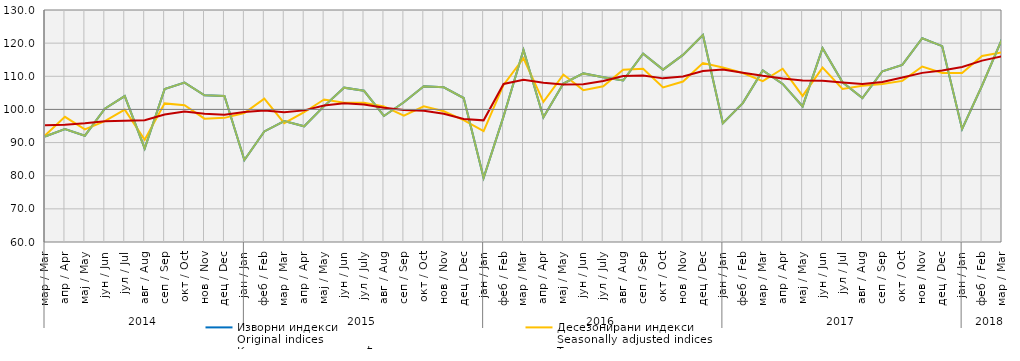
| Category | Изворни индекси
Original indices | Десезонирани индекси
Seasonally adjusted indices | Календарски прилагођени индекси
Working-day adjusted indices | Тренд
Trend |
|---|---|---|---|---|
| 0 | 91.819 | 92.148 | 91.819 | 95.221 |
| 1 | 94.098 | 97.769 | 94.098 | 95.385 |
| 2 | 92.073 | 93.987 | 92.073 | 95.834 |
| 3 | 100.223 | 96.462 | 100.223 | 96.444 |
| 4 | 104.036 | 99.916 | 104.036 | 96.582 |
| 5 | 88.225 | 90.838 | 88.225 | 96.764 |
| 6 | 106.132 | 101.823 | 106.132 | 98.447 |
| 7 | 108.074 | 101.276 | 108.074 | 99.381 |
| 8 | 104.242 | 97.219 | 104.242 | 98.666 |
| 9 | 104.032 | 97.459 | 104.032 | 98.41 |
| 10 | 84.716 | 98.882 | 84.716 | 99.254 |
| 11 | 93.365 | 103.251 | 93.365 | 99.647 |
| 12 | 96.491 | 95.863 | 96.491 | 99.131 |
| 13 | 94.914 | 99.15 | 94.914 | 99.711 |
| 14 | 101.001 | 103.004 | 101.001 | 101.207 |
| 15 | 106.571 | 102.05 | 106.571 | 101.87 |
| 16 | 105.634 | 101.989 | 105.634 | 101.48 |
| 17 | 98.032 | 100.923 | 98.032 | 100.541 |
| 18 | 102.175 | 98.119 | 102.175 | 99.843 |
| 19 | 106.973 | 100.927 | 106.973 | 99.608 |
| 20 | 106.679 | 99.459 | 106.679 | 98.701 |
| 21 | 103.448 | 96.757 | 103.448 | 97.119 |
| 22 | 79.358 | 93.437 | 79.358 | 96.709 |
| 23 | 97.898 | 107.388 | 97.898 | 107.672 |
| 24 | 117.913 | 115.451 | 117.913 | 108.92 |
| 25 | 97.629 | 102.272 | 97.629 | 108.062 |
| 26 | 107.793 | 110.515 | 107.793 | 107.502 |
| 27 | 110.869 | 105.829 | 110.869 | 107.588 |
| 28 | 109.684 | 107.005 | 109.684 | 108.553 |
| 29 | 108.719 | 111.971 | 108.719 | 110.088 |
| 30 | 116.799 | 112.303 | 116.799 | 110.22 |
| 31 | 112.011 | 106.633 | 112.011 | 109.372 |
| 32 | 116.451 | 108.413 | 116.451 | 109.942 |
| 33 | 122.432 | 114.009 | 122.432 | 111.578 |
| 34 | 95.812 | 112.675 | 95.812 | 112.013 |
| 35 | 101.907 | 110.989 | 101.907 | 111.084 |
| 36 | 111.746 | 108.554 | 111.746 | 110.137 |
| 37 | 107.7 | 112.273 | 107.7 | 109.349 |
| 38 | 100.901 | 104.069 | 100.901 | 108.717 |
| 39 | 118.466 | 112.61 | 118.466 | 108.644 |
| 40 | 108.212 | 106.193 | 108.212 | 108.132 |
| 41 | 103.433 | 107.11 | 103.433 | 107.692 |
| 42 | 111.521 | 107.677 | 111.521 | 108.253 |
| 43 | 113.414 | 108.611 | 113.414 | 109.624 |
| 44 | 121.479 | 112.939 | 121.479 | 111.033 |
| 45 | 119.1 | 111.017 | 119.1 | 111.741 |
| 46 | 94.101 | 110.957 | 94.101 | 112.831 |
| 47 | 107.2 | 116.144 | 107.218 | 114.732 |
| 48 | 121.246 | 117.221 | 121.246 | 116.02 |